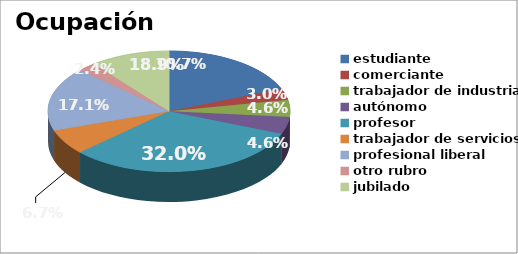
| Category | Series 0 |
|---|---|
| estudiante | 0.189 |
| comerciante | 0.03 |
| trabajador de industria | 0.046 |
| autónomo | 0.046 |
| profesor    | 0.32 |
| trabajador de servicios | 0.067 |
| profesional liberal | 0.171 |
| otro rubro | 0.024 |
| jubilado | 0.107 |